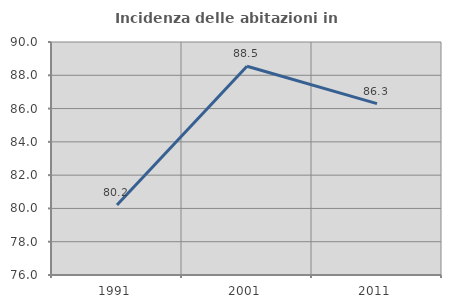
| Category | Incidenza delle abitazioni in proprietà  |
|---|---|
| 1991.0 | 80.208 |
| 2001.0 | 88.542 |
| 2011.0 | 86.294 |